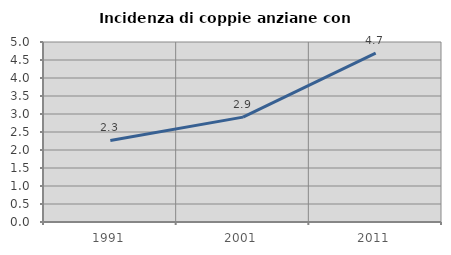
| Category | Incidenza di coppie anziane con figli |
|---|---|
| 1991.0 | 2.265 |
| 2001.0 | 2.913 |
| 2011.0 | 4.691 |